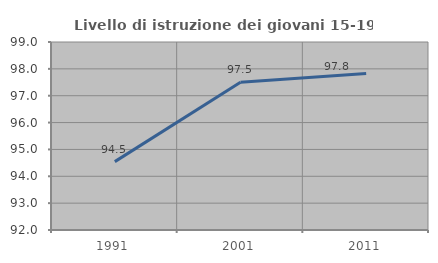
| Category | Livello di istruzione dei giovani 15-19 anni |
|---|---|
| 1991.0 | 94.545 |
| 2001.0 | 97.5 |
| 2011.0 | 97.826 |